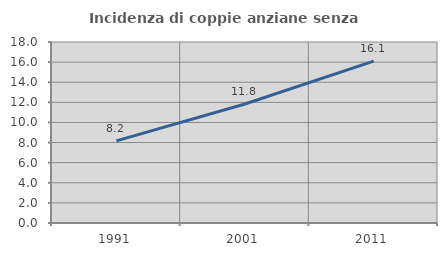
| Category | Incidenza di coppie anziane senza figli  |
|---|---|
| 1991.0 | 8.172 |
| 2001.0 | 11.839 |
| 2011.0 | 16.097 |